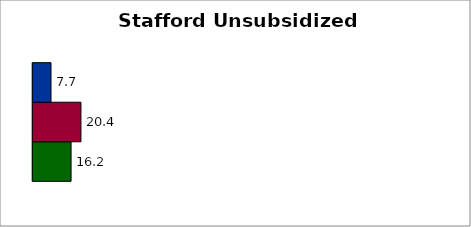
| Category | State | SREB states | 50 states and D.C. |
|---|---|---|---|
| 0 | 16.189 | 20.366 | 7.701 |